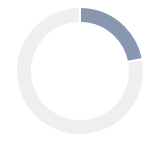
| Category | Series 0 |
|---|---|
| 0 | 0.22 |
| 1 | 0.78 |